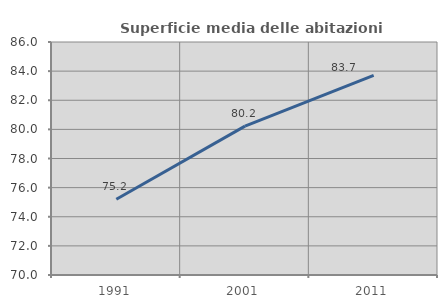
| Category | Superficie media delle abitazioni occupate |
|---|---|
| 1991.0 | 75.201 |
| 2001.0 | 80.22 |
| 2011.0 | 83.703 |